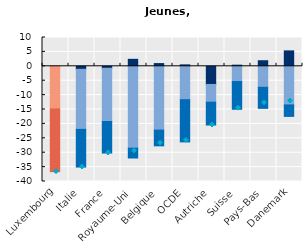
| Category | Heures par salarié en emploi | Emploi sans heures travaillées | Chômage (net de l'évolution démographique) |
|---|---|---|---|
| Luxembourg | 0.009 | -14.801 | -21.785 |
| Italie | -1.053 | -20.845 | -13.086 |
| France | -0.697 | -18.472 | -10.947 |
| Royaume-Uni | 2.423 | -28.43 | -3.409 |
| Belgique | 0.948 | -22.146 | -5.469 |
| OCDE | 0.5 | -11.603 | -14.647 |
| Autriche | -6.3 | -6.153 | -7.937 |
| Suisse | 0.393 | -5.297 | -9.62 |
| Pays-Bas | 1.932 | -7.292 | -7.312 |
| Danemark | 5.35 | -13.408 | -3.987 |